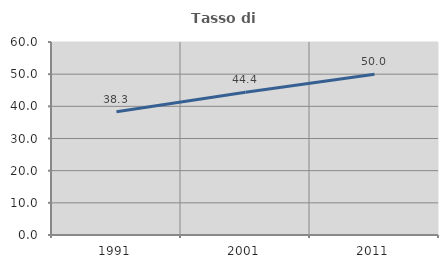
| Category | Tasso di occupazione   |
|---|---|
| 1991.0 | 38.296 |
| 2001.0 | 44.368 |
| 2011.0 | 50 |